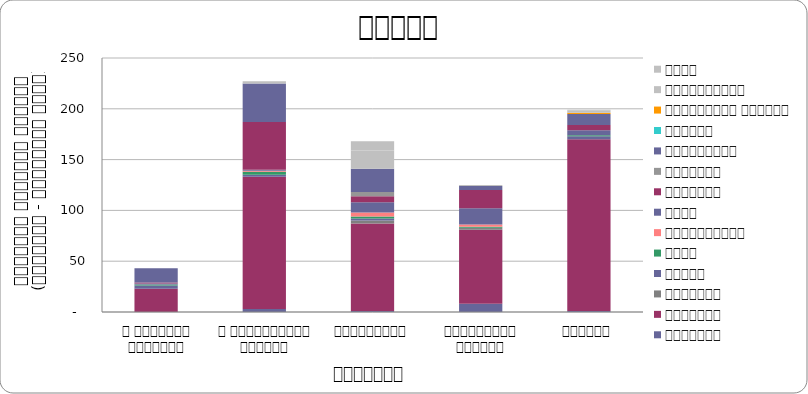
| Category | सुरक्षा | राजनीति | आन्दोलन | न्याय | शासन | अर्थतन्त्र | समाज | कुटनीति | वातावरण | स्वास्थ्य  | शिक्षा | प्राकृतिक प्रकोप | भ्रष्टाचार | अन्य |
|---|---|---|---|---|---|---|---|---|---|---|---|---|---|---|
| द हिमालयन टाइम्स् | 0 | 23 | 0 | 3 | 1 | 0 | 1 | 1 | 0 | 14 | 0 | 0 | 0 | 0 |
| द काठमाण्डौं पोस्ट् | 3 | 130 | 0 | 2 | 3 | 1 | 1 | 47 | 0 | 38 | 0 | 0 | 0 | 2 |
| कान्तिपुर | 1 | 86 | 3 | 2 | 2 | 4 | 10 | 6 | 4 | 23 | 0 | 0 | 18 | 9 |
| अन्नपूर्ण पोस्ट् | 8 | 73 | 2 | 0 | 1 | 2 | 16 | 18 | 0 | 4 | 0 | 0 | 0 | 1 |
| नागरिक | 1 | 169 | 0 | 3 | 1 | 0 | 5 | 5 | 0 | 11 | 0 | 1 | 2 | 1 |